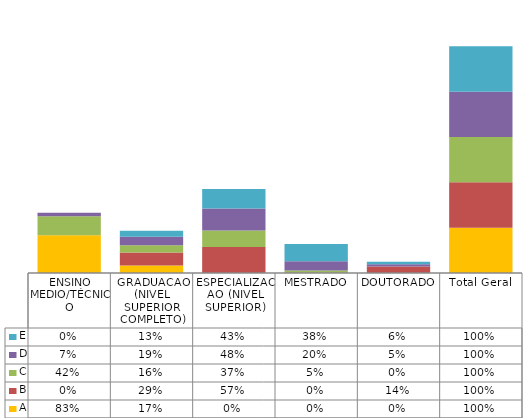
| Category | A | B | C | D | E |
|---|---|---|---|---|---|
| ENSINO MEDIO/TÉCNICO | 0.833 | 0 | 0.421 | 0.074 | 0 |
| GRADUACAO (NIVEL SUPERIOR COMPLETO) | 0.167 | 0.286 | 0.158 | 0.19 | 0.131 |
| ESPECIALIZACAO (NIVEL SUPERIOR) | 0 | 0.571 | 0.368 | 0.483 | 0.428 |
| MESTRADO | 0 | 0 | 0.053 | 0.205 | 0.381 |
| DOUTORADO | 0 | 0.143 | 0 | 0.048 | 0.059 |
| Total Geral | 1 | 1 | 1 | 1 | 1 |